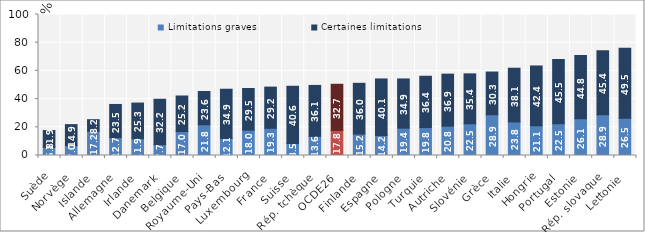
| Category | Limitations graves | Certaines limitations |
|---|---|---|
| Suède | 5.8 | 11.9 |
| Norvège | 7 | 14.9 |
| Islande | 17.2 | 8.2 |
| Allemagne | 12.7 | 23.5 |
| Irlande | 11.9 | 25.3 |
| Danemark | 7.7 | 32.2 |
| Belgique | 17 | 25.2 |
| Royaume-Uni | 21.8 | 23.6 |
| Pays-Bas | 12.1 | 34.9 |
| Luxembourg | 18 | 29.5 |
| France | 19.3 | 29.2 |
| Suisse | 8.5 | 40.6 |
| Rép. tchèque | 13.6 | 36.1 |
| OCDE26 | 17.781 | 32.723 |
| Finlande | 15.2 | 36 |
| Espagne | 14.2 | 40.1 |
| Pologne | 19.4 | 34.9 |
| Turquie | 19.8 | 36.4 |
| Autriche | 20.8 | 36.9 |
| Slovénie | 22.5 | 35.4 |
| Grèce | 28.9 | 30.3 |
| Italie | 23.8 | 38.1 |
| Hongrie | 21.1 | 42.4 |
| Portugal | 22.5 | 45.5 |
| Estonie | 26.1 | 44.8 |
| Rép. slovaque | 28.9 | 45.4 |
| Lettonie | 26.5 | 49.5 |